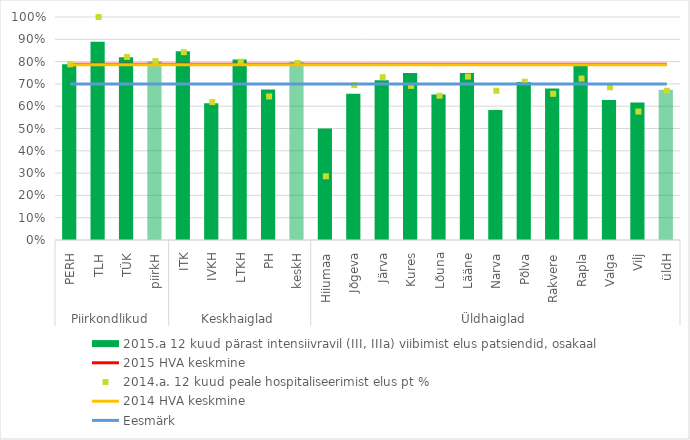
| Category | 2015.a 12 kuud pärast intensiivravil (III, IIIa) viibimist elus patsiendid, osakaal |
|---|---|
| 0 | 0.788 |
| 1 | 0.889 |
| 2 | 0.82 |
| 3 | 0.801 |
| 4 | 0.847 |
| 5 | 0.613 |
| 6 | 0.809 |
| 7 | 0.675 |
| 8 | 0.8 |
| 9 | 0.5 |
| 10 | 0.655 |
| 11 | 0.717 |
| 12 | 0.749 |
| 13 | 0.652 |
| 14 | 0.749 |
| 15 | 0.583 |
| 16 | 0.708 |
| 17 | 0.68 |
| 18 | 0.784 |
| 19 | 0.628 |
| 20 | 0.616 |
| 21 | 0.674 |